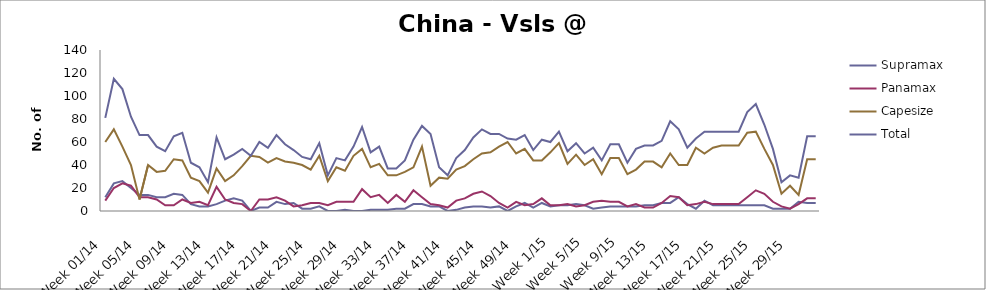
| Category | Supramax | Panamax | Capesize | Total |
|---|---|---|---|---|
| Week 01/14 | 12 | 9 | 60 | 81 |
| Week 02/14 | 24 | 20 | 71 | 115 |
| Week 03/14 | 26 | 24 | 56 | 106 |
| Week 04/14 | 20 | 22 | 40 | 82 |
| Week 05/14 | 14 | 12 | 10 | 66 |
| Week 06/14 | 14 | 12 | 40 | 66 |
| Week 07/14 | 12 | 10 | 34 | 56 |
| Week 08/14 | 12 | 5 | 35 | 52 |
| Week 09/14 | 15 | 5 | 45 | 65 |
| Week 10/14 | 14 | 10 | 44 | 68 |
| Week 11/14 | 6 | 7 | 29 | 42 |
| Week 12/14 | 4 | 8 | 26 | 38 |
| Week 13/14 | 4 | 5 | 16 | 25 |
| Week 14/14 | 6 | 21 | 37 | 64 |
| Week 15/14 | 9 | 10 | 26 | 45 |
| Week 16/14 | 11 | 7 | 31 | 49 |
| Week 17/14 | 9 | 6 | 39 | 54 |
| Week 18/14 | 0 | 0 | 48 | 48 |
| Week 19/14 | 3 | 10 | 47 | 60 |
| Week 20/14 | 3 | 10 | 42 | 55 |
| Week 21/14 | 8 | 12 | 46 | 66 |
| Week 22/14 | 6 | 9 | 43 | 58 |
| Week 23/14 | 7 | 4 | 42 | 53 |
| Week 24/14 | 2 | 5 | 40 | 47 |
| Week 25/14 | 2 | 7 | 36 | 45 |
| Week 26/14 | 4 | 7 | 48 | 59 |
| Week 27/14 | 0 | 5 | 26 | 31 |
| Week 28/14 | 0 | 8 | 38 | 46 |
| Week 29/14 | 1 | 8 | 35 | 44 |
| Week 30/14 | 0 | 8 | 48 | 56 |
| Week 31/14 | 0 | 19 | 54 | 73 |
| Week 32/14 | 1 | 12 | 38 | 51 |
| Week 33/14 | 1 | 14 | 41 | 56 |
| Week 34/14 | 1 | 7 | 31 | 37 |
| Week 35/14 | 2 | 14 | 31 | 37 |
| Week 36/14 | 2 | 8 | 34 | 44 |
| Week 37/14 | 6 | 18 | 38 | 62 |
| Week 38/14 | 6 | 12 | 56 | 74 |
| Week 39/14 | 4 | 6 | 22 | 67 |
| Week 40/14 | 4 | 5 | 29 | 38 |
| Week 41/14 | 0 | 3 | 28 | 31 |
| Week 42/14 | 1 | 9 | 36 | 46 |
| Week 43/14 | 3 | 11 | 39 | 53 |
| Week 44/14 | 4 | 15 | 45 | 64 |
| Week 45/14 | 4 | 17 | 50 | 71 |
| Week 46/14 | 3 | 13 | 51 | 67 |
| Week 47/14 | 4 | 7 | 56 | 67 |
| Week 48/14 | 0 | 3 | 60 | 63 |
| Week 49/14 | 4 | 8 | 50 | 62 |
| Week 50/14 | 7 | 5 | 54 | 66 |
| Week 51/14 | 3 | 6 | 44 | 53 |
| Week 52/14 | 7 | 11 | 44 | 62 |
| Week 1/15 | 4 | 5 | 51 | 60 |
| Week 2/15 | 5 | 5 | 59 | 69 |
| Week 3/15 | 5 | 6 | 41 | 52 |
| Week 4/15 | 6 | 4 | 49 | 59 |
| Week 5/15 | 5 | 5 | 40 | 50 |
| Week 6/15 | 2 | 8 | 45 | 55 |
| Week 7/15 | 3 | 9 | 32 | 44 |
| Week 8/15 | 4 | 8 | 46 | 58 |
| Week 9/15 | 4 | 8 | 46 | 58 |
| Week 10/15 | 4 | 4 | 32 | 42 |
| Week 11/15 | 4 | 6 | 36 | 54 |
| Week 12/15 | 5 | 3 | 43 | 57 |
| Week 13/15 | 5 | 3 | 43 | 57 |
| Week 14/15 | 7 | 7 | 38 | 61 |
| Week 15/15 | 7 | 13 | 50 | 78 |
| Week 16/15 | 12 | 12 | 40 | 71 |
| Week 17/15 | 6 | 5 | 40 | 55 |
| Week 18/15 | 2 | 6 | 55 | 63 |
| Week 19/15 | 9 | 8 | 50 | 69 |
| Week 20/15 | 5 | 6 | 55 | 69 |
| Week 21/15 | 5 | 6 | 57 | 69 |
| Week 22/15 | 5 | 6 | 57 | 69 |
| Week 23/15 | 5 | 6 | 57 | 69 |
| Week 24/15 | 5 | 12 | 68 | 86 |
| Week 25/15 | 5 | 18 | 69 | 93 |
| Week 26/15 | 5 | 15 | 54 | 75 |
| Week 27/15 | 2 | 8 | 40 | 54 |
| Week 28/15 | 2 | 4 | 15 | 25 |
| Week 29/15 | 2 | 2 | 22 | 31 |
| Week 30/15 | 8 | 6 | 14 | 29 |
| Week 31/15 | 7 | 11 | 45 | 65 |